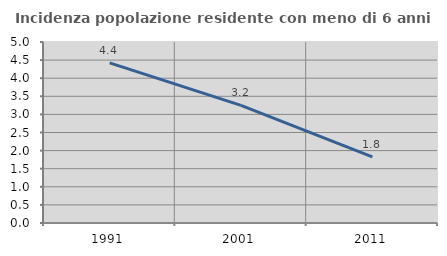
| Category | Incidenza popolazione residente con meno di 6 anni |
|---|---|
| 1991.0 | 4.425 |
| 2001.0 | 3.249 |
| 2011.0 | 1.826 |